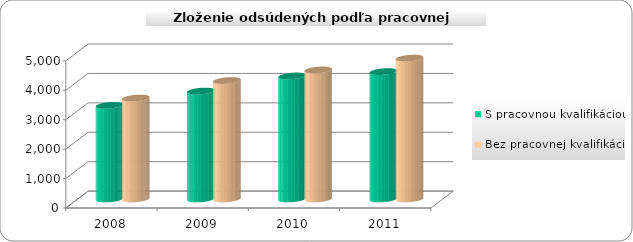
| Category | S pracovnou kvalifikáciou | Bez pracovnej kvalifikácie |
|---|---|---|
| 2008.0 | 3182 | 3431 |
| 2009.0 | 3669 | 4026 |
| 2010.0 | 4181 | 4386 |
| 2011.0 | 4330 | 4788 |